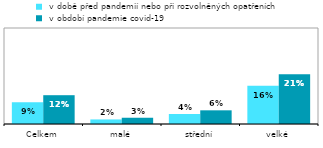
| Category |  v době před pandemií nebo při rozvolněných opatřeních |  v období pandemie covid-19 |
|---|---|---|
| Celkem | 0.091 | 0.12 |
| malé | 0.019 | 0.026 |
| střední | 0.042 | 0.057 |
| velké | 0.159 | 0.207 |